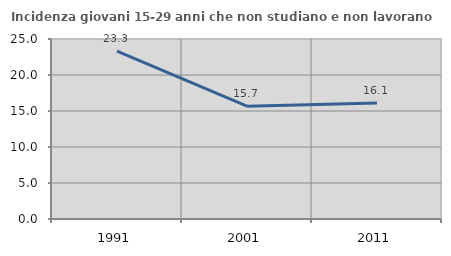
| Category | Incidenza giovani 15-29 anni che non studiano e non lavorano  |
|---|---|
| 1991.0 | 23.332 |
| 2001.0 | 15.675 |
| 2011.0 | 16.105 |